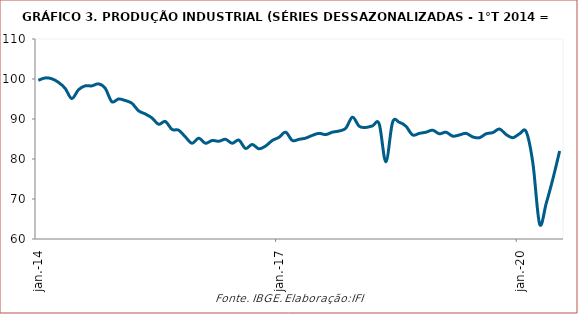
| Category | Produção industrial |
|---|---|
| 2014-01-01 | 99.67 |
| 2014-02-01 | 100.264 |
| 2014-03-01 | 100.066 |
| 2014-04-01 | 99.175 |
| 2014-05-01 | 97.691 |
| 2014-06-01 | 95.117 |
| 2014-07-01 | 97.295 |
| 2014-08-01 | 98.284 |
| 2014-09-01 | 98.284 |
| 2014-10-01 | 98.779 |
| 2014-11-01 | 97.691 |
| 2014-12-01 | 94.325 |
| 2015-01-01 | 95.018 |
| 2015-02-01 | 94.622 |
| 2015-03-01 | 93.929 |
| 2015-04-01 | 92.049 |
| 2015-05-01 | 91.257 |
| 2015-06-01 | 90.267 |
| 2015-07-01 | 88.684 |
| 2015-08-01 | 89.376 |
| 2015-09-01 | 87.397 |
| 2015-10-01 | 87.199 |
| 2015-11-01 | 85.516 |
| 2015-12-01 | 83.933 |
| 2016-01-01 | 85.219 |
| 2016-02-01 | 83.933 |
| 2016-03-01 | 84.626 |
| 2016-04-01 | 84.428 |
| 2016-05-01 | 84.922 |
| 2016-06-01 | 83.933 |
| 2016-07-01 | 84.725 |
| 2016-08-01 | 82.646 |
| 2016-09-01 | 83.636 |
| 2016-10-01 | 82.547 |
| 2016-11-01 | 83.24 |
| 2016-12-01 | 84.626 |
| 2017-01-01 | 85.417 |
| 2017-02-01 | 86.704 |
| 2017-03-01 | 84.626 |
| 2017-04-01 | 84.922 |
| 2017-05-01 | 85.219 |
| 2017-06-01 | 85.912 |
| 2017-07-01 | 86.407 |
| 2017-08-01 | 86.11 |
| 2017-09-01 | 86.704 |
| 2017-10-01 | 87.001 |
| 2017-11-01 | 87.694 |
| 2017-12-01 | 90.465 |
| 2018-01-01 | 88.189 |
| 2018-02-01 | 87.892 |
| 2018-03-01 | 88.288 |
| 2018-04-01 | 88.783 |
| 2018-05-01 | 79.281 |
| 2018-06-01 | 89.178 |
| 2018-07-01 | 89.178 |
| 2018-08-01 | 88.189 |
| 2018-09-01 | 86.011 |
| 2018-10-01 | 86.407 |
| 2018-11-01 | 86.704 |
| 2018-12-01 | 87.199 |
| 2019-01-01 | 86.308 |
| 2019-02-01 | 86.704 |
| 2019-03-01 | 85.714 |
| 2019-04-01 | 86.011 |
| 2019-05-01 | 86.407 |
| 2019-06-01 | 85.516 |
| 2019-07-01 | 85.318 |
| 2019-08-01 | 86.308 |
| 2019-09-01 | 86.605 |
| 2019-10-01 | 87.496 |
| 2019-11-01 | 86.11 |
| 2019-12-01 | 85.318 |
| 2020-01-01 | 86.308 |
| 2020-02-01 | 86.803 |
| 2020-03-01 | 78.885 |
| 2020-04-01 | 63.741 |
| 2020-05-01 | 68.987 |
| 2020-06-01 | 75.124 |
| 2020-07-01 | 82.007 |